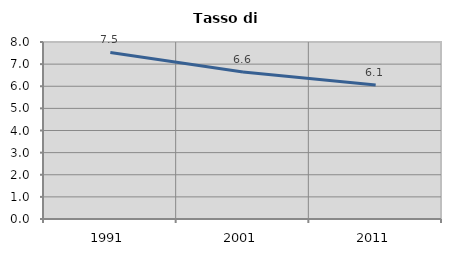
| Category | Tasso di disoccupazione   |
|---|---|
| 1991.0 | 7.53 |
| 2001.0 | 6.648 |
| 2011.0 | 6.054 |